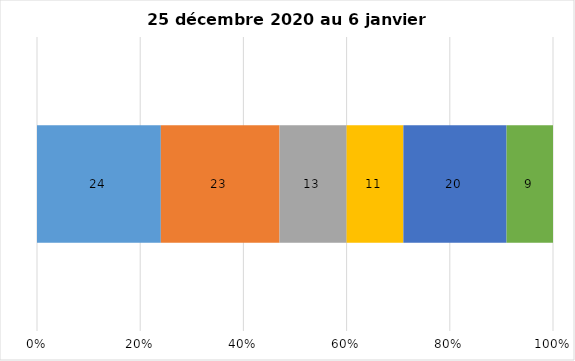
| Category | Plusieurs fois par jour | Une fois par jour | Quelques fois par semaine   | Une fois par semaine ou moins   |  Jamais   |  Je n’utilise pas les médias sociaux |
|---|---|---|---|---|---|---|
| 0 | 24 | 23 | 13 | 11 | 20 | 9 |